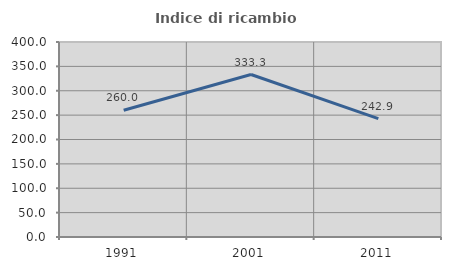
| Category | Indice di ricambio occupazionale  |
|---|---|
| 1991.0 | 260 |
| 2001.0 | 333.333 |
| 2011.0 | 242.857 |